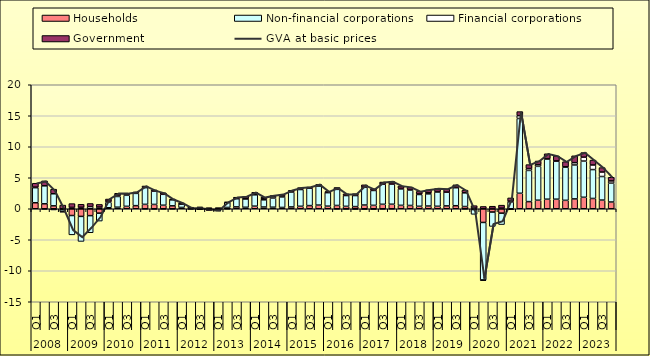
| Category | Households | Non-financial corporations | Financial corporations | Government |
|---|---|---|---|---|
| 0 | 0.97 | 2.43 | 0.09 | 0.63 |
| 1 | 0.8 | 2.9 | -0.08 | 0.8 |
| 2 | 0.47 | 1.95 | -0.2 | 0.74 |
| 3 | -0.15 | -0.3 | -0.1 | 0.59 |
| 4 | -1.09 | -3.12 | 0.22 | 0.61 |
| 5 | -1.23 | -4.04 | 0.24 | 0.48 |
| 6 | -1.11 | -2.76 | 0.35 | 0.5 |
| 7 | -0.71 | -1.28 | 0.27 | 0.43 |
| 8 | 0.16 | 0.88 | 0.19 | 0.34 |
| 9 | 0.25 | 1.73 | 0.21 | 0.31 |
| 10 | 0.39 | 1.78 | 0.13 | 0.18 |
| 11 | 0.5 | 1.98 | 0.1 | 0.12 |
| 12 | 0.71 | 2.7 | -0.04 | 0.26 |
| 13 | 0.7 | 2.15 | -0.08 | 0.2 |
| 14 | 0.57 | 1.76 | -0.05 | 0.25 |
| 15 | 0.47 | 0.97 | -0.03 | 0.13 |
| 16 | 0.21 | 0.55 | 0.02 | 0.15 |
| 17 | 0.08 | -0.07 | 0.09 | 0.03 |
| 18 | 0.2 | -0.16 | 0 | 0.07 |
| 19 | 0.18 | -0.1 | -0.05 | -0.11 |
| 20 | 0.04 | -0.3 | -0.06 | 0.13 |
| 21 | 0.21 | 0.79 | -0.02 | 0.1 |
| 22 | 0.3 | 1.34 | 0.02 | 0.2 |
| 23 | 0.24 | 1.36 | 0.02 | 0.36 |
| 24 | 0.42 | 1.83 | 0.21 | 0.19 |
| 25 | 0.28 | 1.16 | 0.19 | 0.21 |
| 26 | 0.25 | 1.47 | 0.25 | 0.16 |
| 27 | 0.21 | 1.7 | 0.24 | 0.17 |
| 28 | 0.29 | 2.4 | 0.09 | 0.19 |
| 29 | 0.4 | 2.7 | 0.1 | 0.21 |
| 30 | 0.51 | 2.8 | 0.04 | 0.15 |
| 31 | 0.59 | 3.07 | 0.06 | 0.21 |
| 32 | 0.42 | 2.2 | 0.01 | 0.14 |
| 33 | 0.53 | 2.6 | -0.05 | 0.3 |
| 34 | 0.39 | 1.74 | -0.07 | 0.28 |
| 35 | 0.35 | 1.78 | -0.1 | 0.3 |
| 36 | 0.6 | 2.89 | -0.12 | 0.37 |
| 37 | 0.55 | 2.4 | -0.12 | 0.28 |
| 38 | 0.72 | 3.24 | -0.06 | 0.35 |
| 39 | 0.73 | 3.25 | -0.02 | 0.43 |
| 40 | 0.55 | 2.65 | 0.09 | 0.39 |
| 41 | 0.53 | 2.49 | 0.09 | 0.38 |
| 42 | 0.4 | 1.9 | 0.09 | 0.41 |
| 43 | 0.44 | 1.96 | 0.17 | 0.49 |
| 44 | 0.4 | 2.3 | 0.07 | 0.49 |
| 45 | 0.46 | 2.22 | 0.01 | 0.51 |
| 46 | 0.49 | 2.92 | 0.03 | 0.42 |
| 47 | 0.36 | 2.21 | -0.03 | 0.43 |
| 48 | -0.13 | -0.77 | 0.11 | 0.39 |
| 49 | -2.21 | -9.28 | -0.11 | 0.37 |
| 50 | -0.53 | -2.32 | 0.04 | 0.37 |
| 51 | -0.71 | -1.84 | 0.1 | 0.48 |
| 52 | -0.16 | 1.11 | 0.12 | 0.52 |
| 53 | 2.5 | 12.06 | 0.46 | 0.65 |
| 54 | 1.15 | 5.03 | 0.3 | 0.64 |
| 55 | 1.38 | 5.46 | 0.27 | 0.59 |
| 56 | 1.54 | 6.48 | 0.06 | 0.79 |
| 57 | 1.54 | 6.13 | 0.05 | 0.8 |
| 58 | 1.36 | 5.34 | 0.07 | 0.82 |
| 59 | 1.59 | 5.47 | 0.37 | 1.11 |
| 60 | 1.85 | 5.84 | 0.63 | 0.74 |
| 61 | 1.66 | 4.66 | 0.74 | 0.79 |
| 62 | 1.4 | 3.8 | 0.72 | 0.72 |
| 63 | 1.09 | 3.04 | 0.36 | 0.59 |